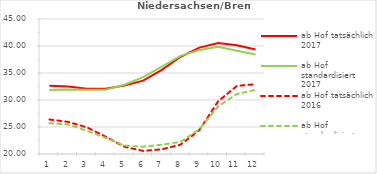
| Category | ab Hof tatsächlich 2017 | ab Hof standardisiert 2017 | ab Hof tatsächlich 2016 | ab Hof standardisiert 2016 |
|---|---|---|---|---|
| 0 | 32.619 | 31.846 | 26.39 | 25.715 |
| 1 | 32.512 | 31.939 | 25.949 | 25.461 |
| 2 | 32.075 | 31.89 | 24.931 | 24.29 |
| 3 | 32.068 | 31.898 | 23.203 | 22.99 |
| 4 | 32.666 | 32.816 | 21.343 | 21.554 |
| 5 | 33.584 | 34.243 | 20.571 | 21.352 |
| 6 | 35.574 | 36.181 | 20.87 | 21.733 |
| 7 | 37.999 | 38.185 | 21.735 | 22.247 |
| 8 | 39.699 | 39.241 | 24.421 | 24.587 |
| 9 | 40.555 | 39.864 | 29.75 | 28.808 |
| 10 | 40.119 | 39.125 | 32.611 | 31.119 |
| 11 | 39.333 | 38.42 | 32.927 | 31.865 |